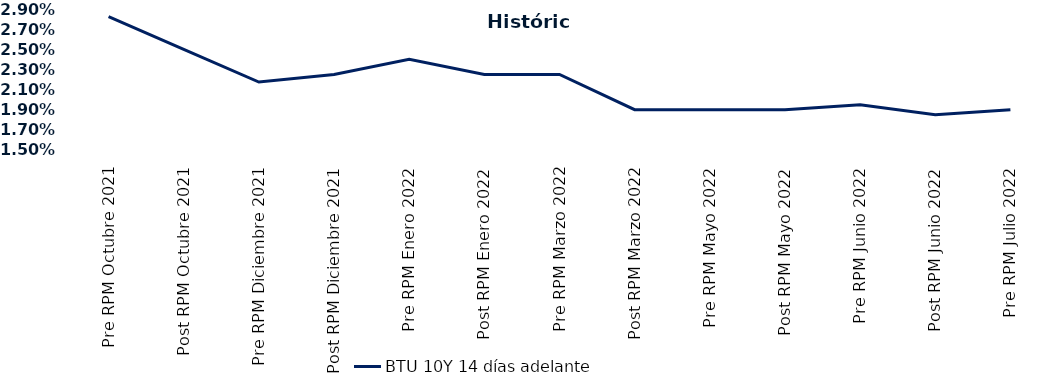
| Category | BTU 10Y 14 días adelante |
|---|---|
| Pre RPM Octubre 2021 | 0.028 |
| Post RPM Octubre 2021 | 0.025 |
| Pre RPM Diciembre 2021 | 0.022 |
| Post RPM Diciembre 2021 | 0.022 |
| Pre RPM Enero 2022 | 0.024 |
| Post RPM Enero 2022 | 0.022 |
| Pre RPM Marzo 2022 | 0.022 |
| Post RPM Marzo 2022 | 0.019 |
| Pre RPM Mayo 2022 | 0.019 |
| Post RPM Mayo 2022 | 0.019 |
| Pre RPM Junio 2022 | 0.02 |
| Post RPM Junio 2022 | 0.018 |
| Pre RPM Julio 2022 | 0.019 |